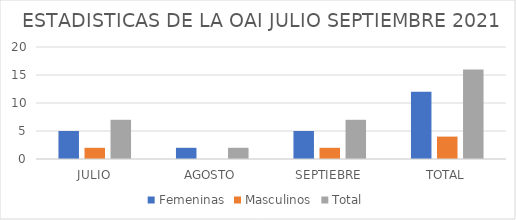
| Category | Femeninas | Masculinos | Total |
|---|---|---|---|
| JULIO | 5 | 2 | 7 |
| AGOSTO | 2 | 0 | 2 |
| SEPTIEBRE | 5 | 2 | 7 |
| TOTAL | 12 | 4 | 16 |